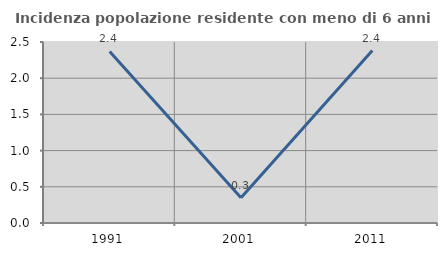
| Category | Incidenza popolazione residente con meno di 6 anni |
|---|---|
| 1991.0 | 2.37 |
| 2001.0 | 0.348 |
| 2011.0 | 2.381 |